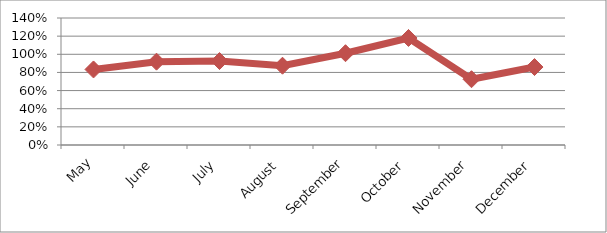
| Category | PERCENTAGE |
|---|---|
| May | 0.833 |
| June | 0.918 |
| July | 0.925 |
| August | 0.874 |
| September | 1.012 |
| October | 1.18 |
| November | 0.725 |
| December | 0.859 |